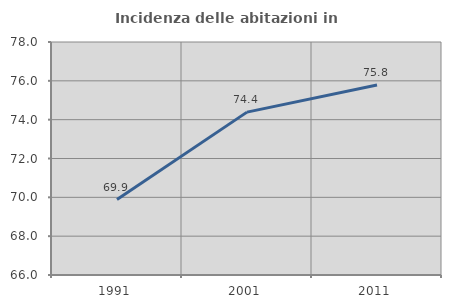
| Category | Incidenza delle abitazioni in proprietà  |
|---|---|
| 1991.0 | 69.886 |
| 2001.0 | 74.388 |
| 2011.0 | 75.783 |